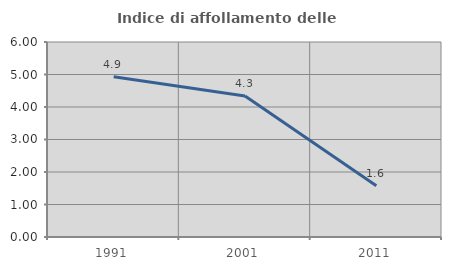
| Category | Indice di affollamento delle abitazioni  |
|---|---|
| 1991.0 | 4.928 |
| 2001.0 | 4.339 |
| 2011.0 | 1.577 |